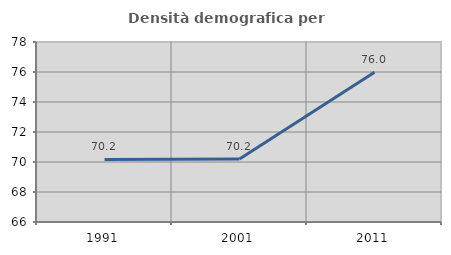
| Category | Densità demografica |
|---|---|
| 1991.0 | 70.17 |
| 2001.0 | 70.207 |
| 2011.0 | 75.987 |